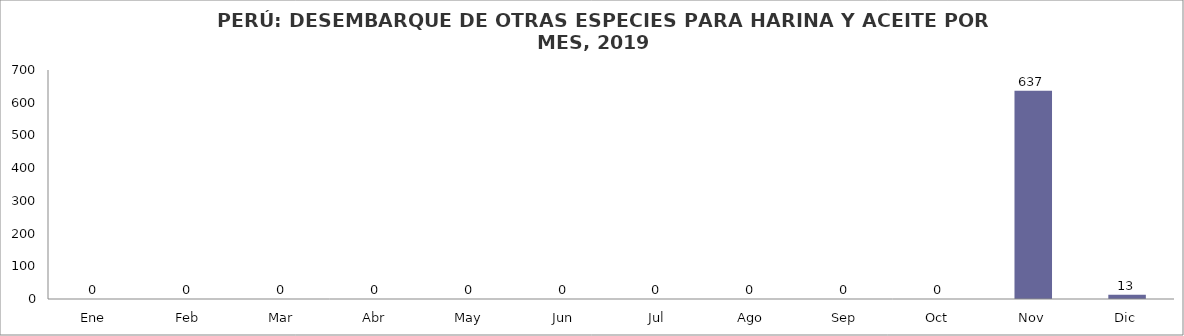
| Category | Total |
|---|---|
| Ene | 0 |
| Feb | 0 |
| Mar | 0 |
| Abr | 0 |
| May | 0 |
| Jun | 0 |
| Jul | 0 |
| Ago | 0 |
| Sep | 0 |
| Oct | 0 |
| Nov | 636.701 |
| Dic | 13.102 |